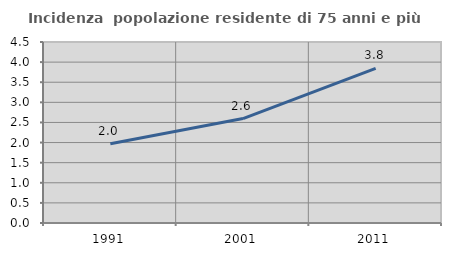
| Category | Incidenza  popolazione residente di 75 anni e più |
|---|---|
| 1991.0 | 1.971 |
| 2001.0 | 2.597 |
| 2011.0 | 3.844 |